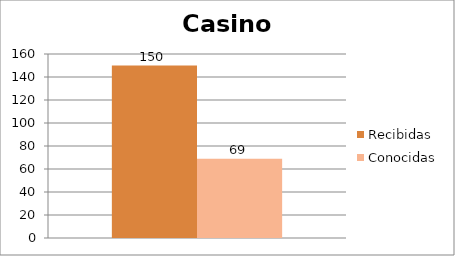
| Category | Recibidas | Conocidas |
|---|---|---|
| 0 | 150 | 69 |